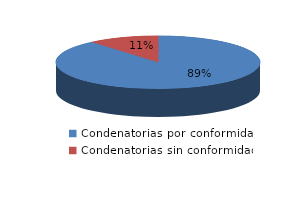
| Category | Series 0 |
|---|---|
| 0 | 24 |
| 1 | 3 |